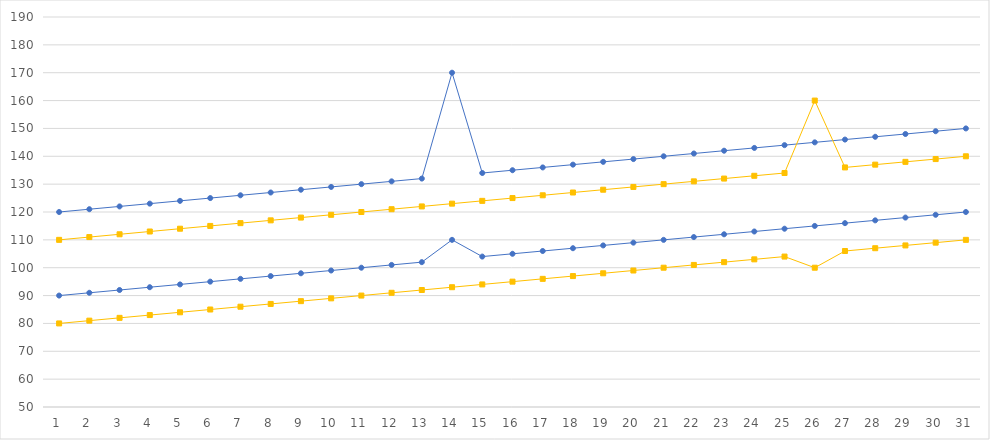
| Category | Series 0 | Series 1 | Series 2 | Series 3 |
|---|---|---|---|---|
| 1.0 | 90 | 120 | 80 | 110 |
| 2.0 | 91 | 121 | 81 | 111 |
| 3.0 | 92 | 122 | 82 | 112 |
| 4.0 | 93 | 123 | 83 | 113 |
| 5.0 | 94 | 124 | 84 | 114 |
| 6.0 | 95 | 125 | 85 | 115 |
| 7.0 | 96 | 126 | 86 | 116 |
| 8.0 | 97 | 127 | 87 | 117 |
| 9.0 | 98 | 128 | 88 | 118 |
| 10.0 | 99 | 129 | 89 | 119 |
| 11.0 | 100 | 130 | 90 | 120 |
| 12.0 | 101 | 131 | 91 | 121 |
| 13.0 | 102 | 132 | 92 | 122 |
| 14.0 | 110 | 170 | 93 | 123 |
| 15.0 | 104 | 134 | 94 | 124 |
| 16.0 | 105 | 135 | 95 | 125 |
| 17.0 | 106 | 136 | 96 | 126 |
| 18.0 | 107 | 137 | 97 | 127 |
| 19.0 | 108 | 138 | 98 | 128 |
| 20.0 | 109 | 139 | 99 | 129 |
| 21.0 | 110 | 140 | 100 | 130 |
| 22.0 | 111 | 141 | 101 | 131 |
| 23.0 | 112 | 142 | 102 | 132 |
| 24.0 | 113 | 143 | 103 | 133 |
| 25.0 | 114 | 144 | 104 | 134 |
| 26.0 | 115 | 145 | 100 | 160 |
| 27.0 | 116 | 146 | 106 | 136 |
| 28.0 | 117 | 147 | 107 | 137 |
| 29.0 | 118 | 148 | 108 | 138 |
| 30.0 | 119 | 149 | 109 | 139 |
| 31.0 | 120 | 150 | 110 | 140 |